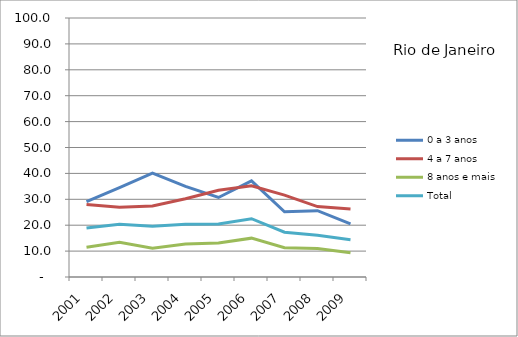
| Category | 0 a 3 anos | 4 a 7 anos | 8 anos e mais | Total |
|---|---|---|---|---|
| 2001.0 | 29.1 | 28 | 11.5 | 18.9 |
| 2002.0 | 34.5 | 26.9 | 13.4 | 20.4 |
| 2003.0 | 40.1 | 27.4 | 11.1 | 19.6 |
| 2004.0 | 35 | 30.2 | 12.7 | 20.4 |
| 2005.0 | 30.7 | 33.5 | 13.1 | 20.5 |
| 2006.0 | 37.1 | 35.2 | 15 | 22.5 |
| 2007.0 | 25.2 | 31.6 | 11.3 | 17.3 |
| 2008.0 | 25.6 | 27.2 | 11 | 16.1 |
| 2009.0 | 20.5 | 26.3 | 9.4 | 14.4 |